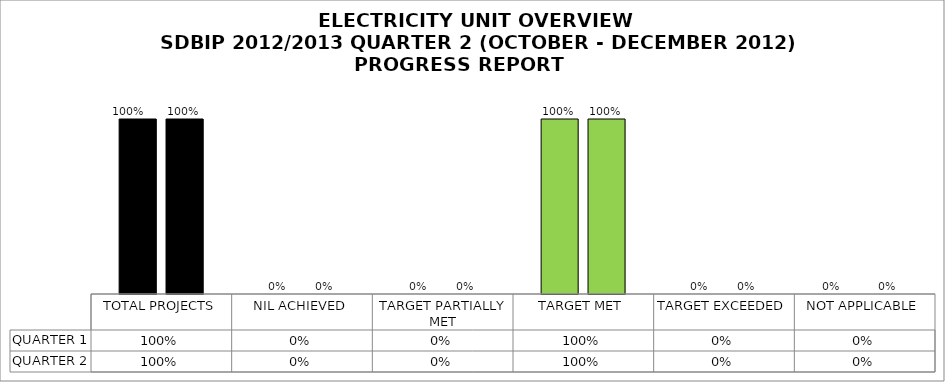
| Category | QUARTER 1 | QUARTER 2 |
|---|---|---|
| TOTAL PROJECTS | 1 | 1 |
| NIL ACHIEVED | 0 | 0 |
| TARGET PARTIALLY MET | 0 | 0 |
| TARGET MET | 1 | 1 |
| TARGET EXCEEDED | 0 | 0 |
| NOT APPLICABLE | 0 | 0 |